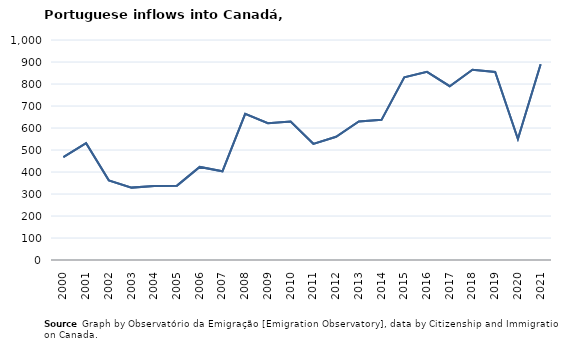
| Category | Entradas |
|---|---|
| 2000.0 | 468 |
| 2001.0 | 531 |
| 2002.0 | 362 |
| 2003.0 | 329 |
| 2004.0 | 336 |
| 2005.0 | 338 |
| 2006.0 | 423 |
| 2007.0 | 403 |
| 2008.0 | 664 |
| 2009.0 | 622 |
| 2010.0 | 629 |
| 2011.0 | 528 |
| 2012.0 | 560 |
| 2013.0 | 630 |
| 2014.0 | 637 |
| 2015.0 | 830 |
| 2016.0 | 855 |
| 2017.0 | 790 |
| 2018.0 | 865 |
| 2019.0 | 855 |
| 2020.0 | 550 |
| 2021.0 | 890 |